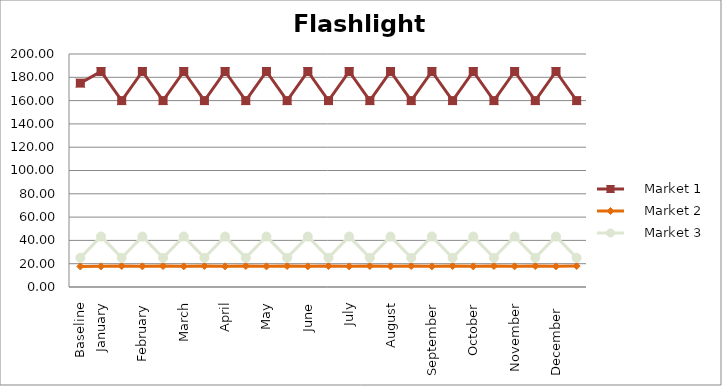
| Category |     Market 1 |     Market 2 |     Market 3 |
|---|---|---|---|
| Baseline | 175 | 17.667 | 25 |
| January | 185 | 17.722 | 43.333 |
|  | 160 | 18 | 25 |
| February | 185 | 17.722 | 43.333 |
|  | 160 | 18 | 25 |
| March | 185 | 17.722 | 43.333 |
|  | 160 | 18 | 25 |
| April | 185 | 17.722 | 43.333 |
|  | 160 | 18 | 25 |
| May | 185 | 17.722 | 43.333 |
|  | 160 | 18 | 25 |
| June | 185 | 17.722 | 43.333 |
|  | 160 | 18 | 25 |
| July | 185 | 17.722 | 43.333 |
|  | 160 | 18 | 25 |
| August | 185 | 17.722 | 43.333 |
|  | 160 | 18 | 25 |
| September | 185 | 17.722 | 43.333 |
|  | 160 | 18 | 25 |
| October | 185 | 17.722 | 43.333 |
|  | 160 | 18 | 25 |
| November | 185 | 17.722 | 43.333 |
|  | 160 | 18 | 25 |
| December  | 185 | 17.722 | 43.333 |